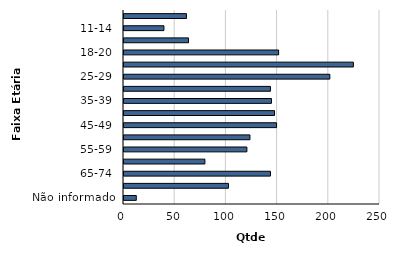
| Category | Qtde Vítimas |
|---|---|
| Não informado | 12 |
| 75+ | 102 |
| 65-74 | 143 |
| 60-64 | 79 |
| 55-59 | 120 |
| 50-54 | 123 |
| 45-49 | 149 |
| 40-44 | 147 |
| 35-39 | 144 |
| 30-34 | 143 |
| 25-29 | 201 |
| 21-24 | 224 |
| 18-20 | 151 |
| 15-17 | 63 |
| 11-14 | 39 |
| 0-10 | 61 |